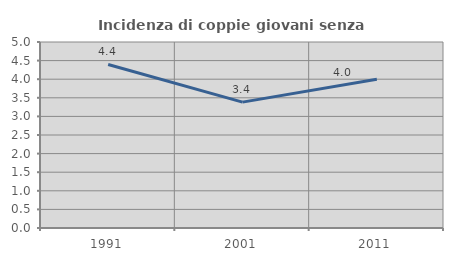
| Category | Incidenza di coppie giovani senza figli |
|---|---|
| 1991.0 | 4.396 |
| 2001.0 | 3.383 |
| 2011.0 | 4 |